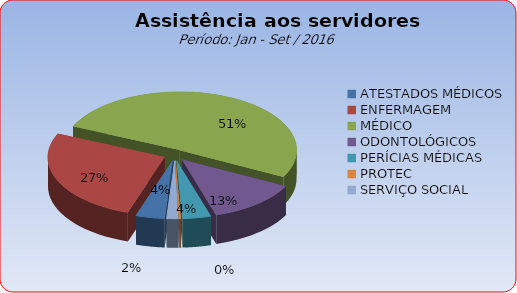
| Category | Series 0 |
|---|---|
| ATESTADOS MÉDICOS | 3.995 |
| ENFERMAGEM | 26.504 |
| MÉDICO | 51.003 |
| ODONTOLÓGICOS | 12.674 |
| PERÍCIAS MÉDICAS | 3.947 |
| PROTEC | 0.257 |
| SERVIÇO SOCIAL | 1.62 |